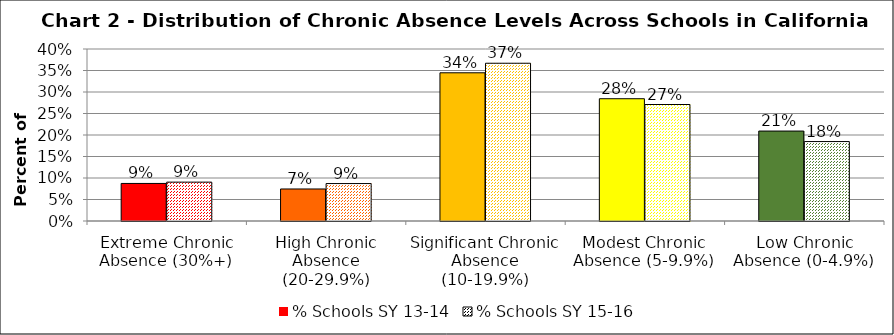
| Category | % Schools SY 13-14 | % Schools SY 15-16 |
|---|---|---|
| Extreme Chronic Absence (30%+) | 0.087 | 0.09 |
| High Chronic Absence (20-29.9%) | 0.074 | 0.087 |
| Significant Chronic Absence (10-19.9%) | 0.345 | 0.367 |
| Modest Chronic Absence (5-9.9%) | 0.284 | 0.271 |
| Low Chronic Absence (0-4.9%) | 0.209 | 0.185 |